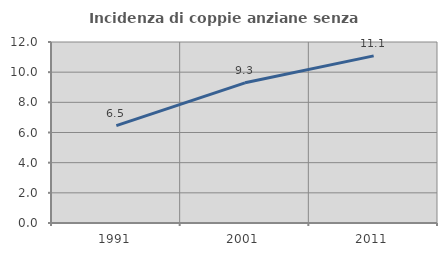
| Category | Incidenza di coppie anziane senza figli  |
|---|---|
| 1991.0 | 6.452 |
| 2001.0 | 9.295 |
| 2011.0 | 11.082 |